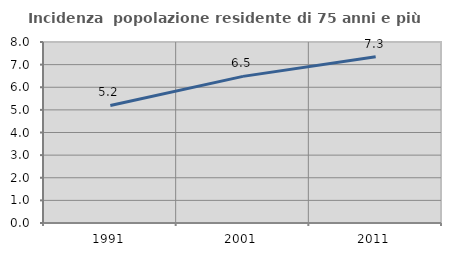
| Category | Incidenza  popolazione residente di 75 anni e più |
|---|---|
| 1991.0 | 5.196 |
| 2001.0 | 6.481 |
| 2011.0 | 7.346 |